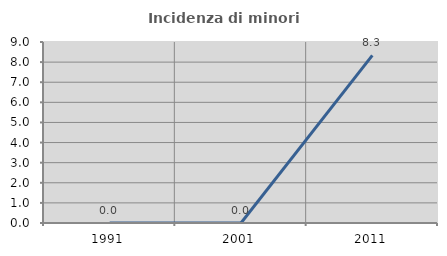
| Category | Incidenza di minori stranieri |
|---|---|
| 1991.0 | 0 |
| 2001.0 | 0 |
| 2011.0 | 8.333 |